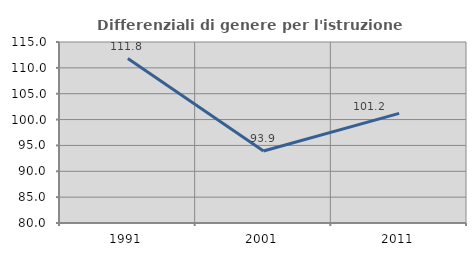
| Category | Differenziali di genere per l'istruzione superiore |
|---|---|
| 1991.0 | 111.8 |
| 2001.0 | 93.914 |
| 2011.0 | 101.199 |